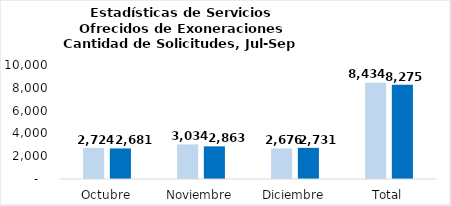
| Category | Tramitadas |
|---|---|
| Octubre | 2681 |
| Noviembre | 2863 |
| Diciembre | 2731 |
| Total | 8275 |